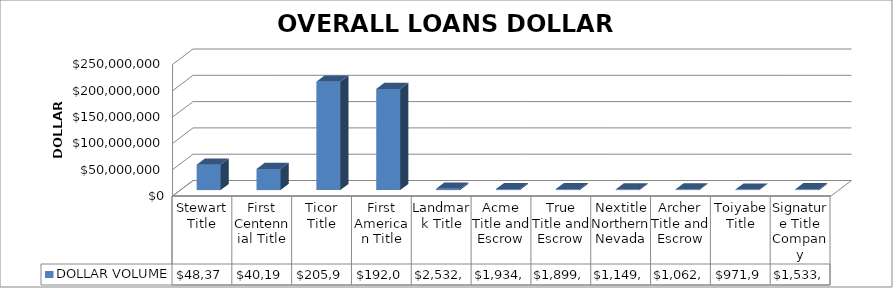
| Category | DOLLAR VOLUME |
|---|---|
| Stewart Title | 48372006.97 |
| First Centennial Title | 40199187 |
| Ticor Title | 205960721 |
| First American Title | 192054700.02 |
| Landmark Title | 2532500 |
| Acme Title and Escrow | 1934900 |
| True Title and Escrow | 1899099 |
| Nextitle Northern Nevada | 1149719 |
| Archer Title and Escrow | 1062200 |
| Toiyabe Title | 971938 |
| Signature Title Company | 1533000 |